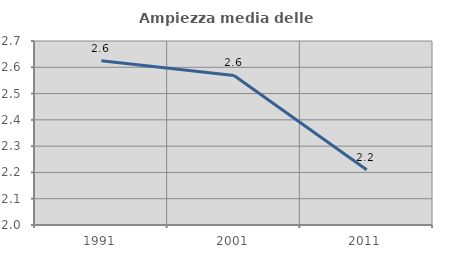
| Category | Ampiezza media delle famiglie |
|---|---|
| 1991.0 | 2.625 |
| 2001.0 | 2.569 |
| 2011.0 | 2.21 |